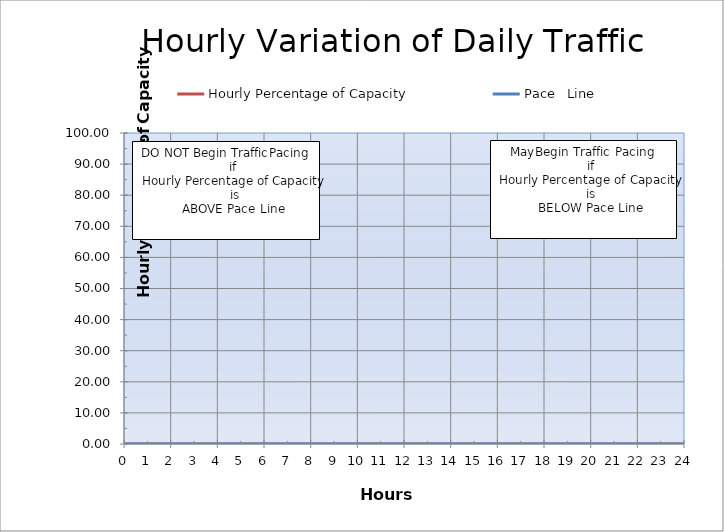
| Category | Hourly Percentage of Capacity | Pace   Line |
|---|---|---|
| 0.0 | 0 | 0 |
| 1.0 | 0 | 0 |
| 2.0 | 0 | 0 |
| 3.0 | 0 | 0 |
| 4.0 | 0 | 0 |
| 5.0 | 0 | 0 |
| 6.0 | 0 | 0 |
| 7.0 | 0 | 0 |
| 8.0 | 0 | 0 |
| 9.0 | 0 | 0 |
| 10.0 | 0 | 0 |
| 11.0 | 0 | 0 |
| 12.0 | 0 | 0 |
| 13.0 | 0 | 0 |
| 14.0 | 0 | 0 |
| 15.0 | 0 | 0 |
| 16.0 | 0 | 0 |
| 17.0 | 0 | 0 |
| 18.0 | 0 | 0 |
| 19.0 | 0 | 0 |
| 20.0 | 0 | 0 |
| 21.0 | 0 | 0 |
| 22.0 | 0 | 0 |
| 23.0 | 0 | 0 |
| 24.0 | 0 | 0 |